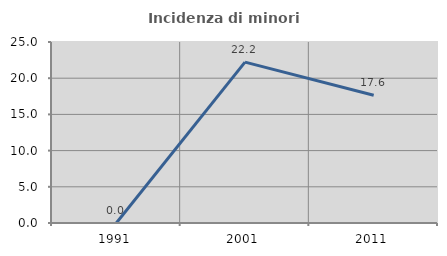
| Category | Incidenza di minori stranieri |
|---|---|
| 1991.0 | 0 |
| 2001.0 | 22.222 |
| 2011.0 | 17.647 |